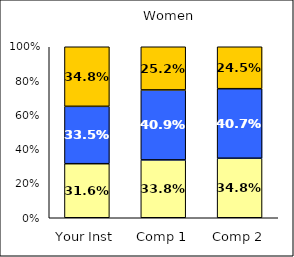
| Category | Low Negative Cross-Racial Interaction | Average Negative Cross-Racial Interaction | High Negative Cross-Racial Interaction |
|---|---|---|---|
| Your Inst | 0.316 | 0.335 | 0.348 |
| Comp 1 | 0.338 | 0.409 | 0.252 |
| Comp 2 | 0.348 | 0.407 | 0.245 |